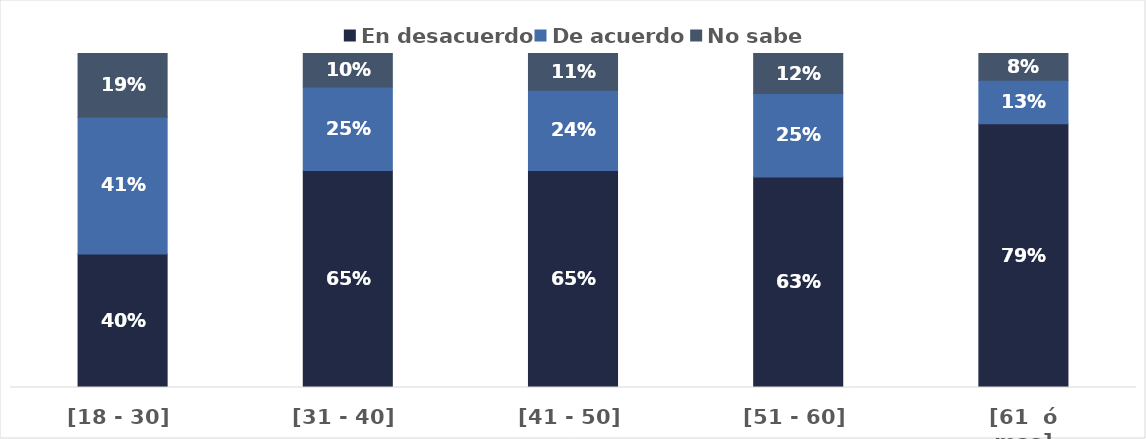
| Category | En desacuerdo | De acuerdo | No sabe |
|---|---|---|---|
| [18 - 30] | 0.4 | 0.41 | 0.19 |
| [31 - 40] | 0.65 | 0.25 | 0.1 |
| [41 - 50] | 0.65 | 0.24 | 0.11 |
| [51 - 60] | 0.63 | 0.25 | 0.12 |
| [61  ó mas] | 0.79 | 0.13 | 0.08 |